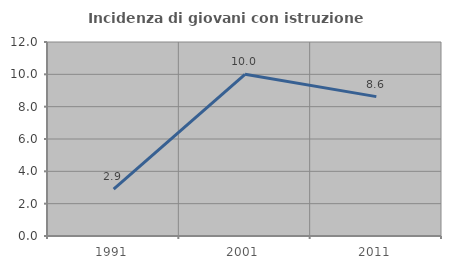
| Category | Incidenza di giovani con istruzione universitaria |
|---|---|
| 1991.0 | 2.899 |
| 2001.0 | 10 |
| 2011.0 | 8.621 |